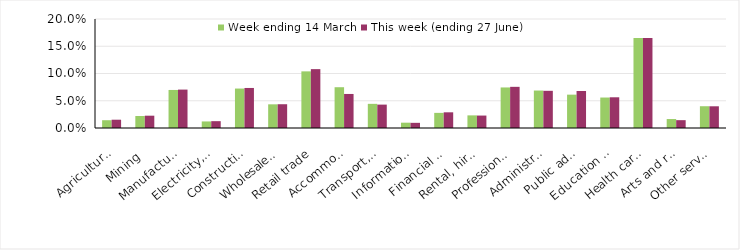
| Category | Week ending 14 March | This week (ending 27 June) |
|---|---|---|
| Agriculture, forestry and fishing | 0.014 | 0.015 |
| Mining | 0.022 | 0.023 |
| Manufacturing | 0.07 | 0.07 |
| Electricity, gas, water and waste services | 0.012 | 0.013 |
| Construction | 0.072 | 0.073 |
| Wholesale trade | 0.043 | 0.044 |
| Retail trade | 0.104 | 0.108 |
| Accommodation and food services | 0.075 | 0.062 |
| Transport, postal and warehousing | 0.044 | 0.043 |
| Information media and telecommunications | 0.01 | 0.009 |
| Financial and insurance services | 0.028 | 0.029 |
| Rental, hiring and real estate services | 0.023 | 0.023 |
| Professional, scientific and technical services | 0.074 | 0.076 |
| Administrative and support services | 0.069 | 0.068 |
| Public administration and safety | 0.061 | 0.068 |
| Education and training | 0.056 | 0.056 |
| Health care and social assistance | 0.165 | 0.165 |
| Arts and recreation services | 0.016 | 0.014 |
| Other services | 0.04 | 0.04 |